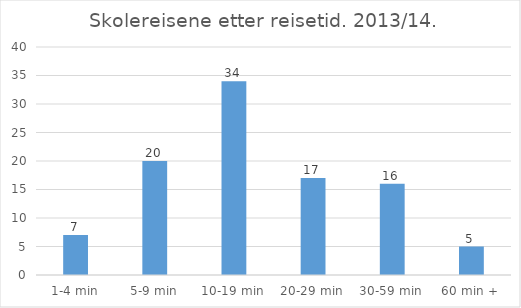
| Category | Andel reiser (i %) |
|---|---|
| 1-4 min | 7 |
| 5-9 min | 20 |
| 10-19 min | 34 |
| 20-29 min | 17 |
| 30-59 min | 16 |
| 60 min + | 5 |